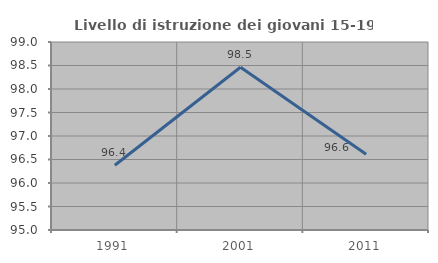
| Category | Livello di istruzione dei giovani 15-19 anni |
|---|---|
| 1991.0 | 96.377 |
| 2001.0 | 98.462 |
| 2011.0 | 96.61 |